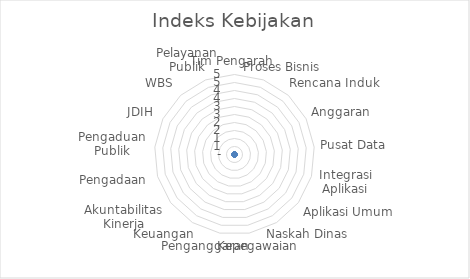
| Category | Series 0 |
|---|---|
| Tim Pengarah | 0 |
| Proses Bisnis | 0 |
| Rencana Induk | 0 |
| Anggaran | 0 |
| Pusat Data | 0 |
| Integrasi Aplikasi | 0 |
| Aplikasi Umum | 0 |
| Naskah Dinas | 0 |
| Kepegawaian | 0 |
| Penganggaran | 0 |
| Keuangan | 0 |
| Akuntabilitas Kinerja | 0 |
| Pengadaan | 0 |
| Pengaduan Publik | 0 |
| JDIH | 0 |
| WBS | 0 |
| Pelayanan Publik | 0 |